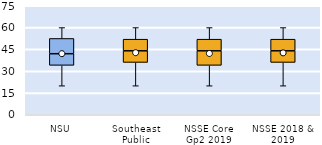
| Category | 25th | 50th | 75th |
|---|---|---|---|
| NSU | 34 | 8 | 10.5 |
| Southeast Public | 36 | 8 | 8 |
| NSSE Core Gp2 2019 | 34 | 10 | 8 |
| NSSE 2018 & 2019 | 36 | 8 | 8 |